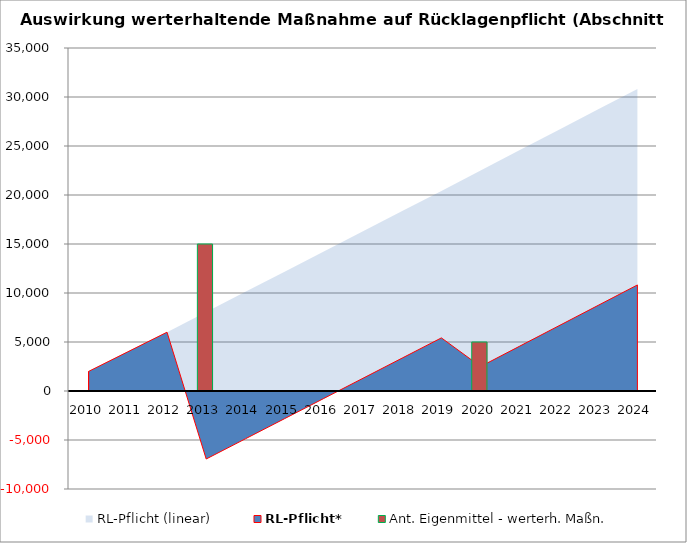
| Category | Ant. Eigenmittel - werterh. Maßn. |
|---|---|
| 0 | 0 |
| 1 | 0 |
| 2 | 0 |
| 3 | 15000 |
| 4 | 0 |
| 5 | 0 |
| 6 | 0 |
| 7 | 0 |
| 8 | 0 |
| 9 | 0 |
| 10 | 5000 |
| 11 | 0 |
| 12 | 0 |
| 13 | 0 |
| 14 | 0 |